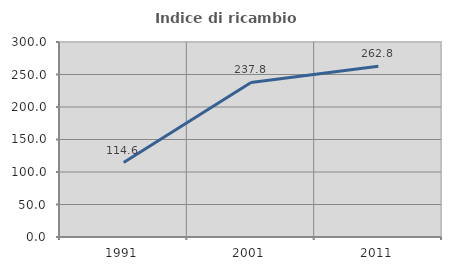
| Category | Indice di ricambio occupazionale  |
|---|---|
| 1991.0 | 114.583 |
| 2001.0 | 237.838 |
| 2011.0 | 262.791 |